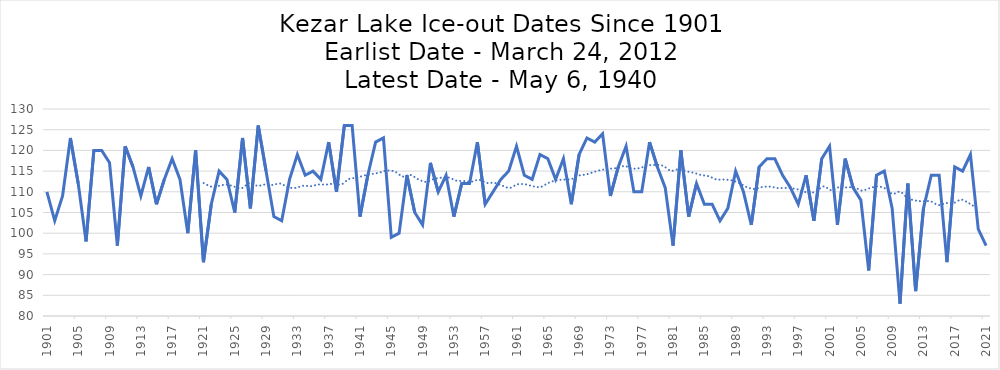
| Category | Series 0 |
|---|---|
| 1901-01-01 | 110 |
| 1902-01-02 | 103 |
| 1903-01-03 | 109 |
| 1904-01-04 | 123 |
| 1905-01-04 | 112 |
| 1906-01-05 | 98 |
| 1907-01-06 | 120 |
| 1908-01-07 | 120 |
| 1909-01-07 | 117 |
| 1910-01-08 | 97 |
| 1911-01-09 | 121 |
| 1912-01-10 | 116 |
| 1913-01-10 | 109 |
| 1914-01-11 | 116 |
| 1915-01-12 | 107 |
| 1916-01-13 | 113 |
| 1917-01-13 | 118 |
| 1918-01-14 | 113 |
| 1919-01-15 | 100 |
| 1920-01-16 | 120 |
| 1921-01-16 | 93 |
| 1922-01-17 | 107 |
| 1923-01-18 | 115 |
| 1924-01-19 | 113 |
| 1925-01-19 | 105 |
| 1926-01-20 | 123 |
| 1927-01-21 | 106 |
| 1928-01-22 | 126 |
| 1929-01-22 | 115 |
| 1930-01-23 | 104 |
| 1931-01-24 | 103 |
| 1932-01-25 | 113 |
| 1933-01-25 | 119 |
| 1934-01-26 | 114 |
| 1935-01-27 | 115 |
| 1936-01-28 | 113 |
| 1937-01-28 | 122 |
| 1938-01-29 | 110 |
| 1939-01-30 | 126 |
| 1940-01-31 | 126 |
| 1941-01-31 | 104 |
| 1942-02-01 | 114 |
| 1943-02-02 | 122 |
| 1944-02-03 | 123 |
| 1945-02-03 | 99 |
| 1946-02-04 | 100 |
| 1947-02-05 | 114 |
| 1948-02-06 | 105 |
| 1949-02-06 | 102 |
| 1950-02-07 | 117 |
| 1951-02-08 | 110 |
| 1952-02-09 | 114 |
| 1953-02-09 | 104 |
| 1954-02-10 | 112 |
| 1955-02-11 | 112 |
| 1956-02-12 | 122 |
| 1957-02-12 | 107 |
| 1958-02-13 | 110 |
| 1959-02-14 | 113 |
| 1960-02-15 | 115 |
| 1961-02-15 | 121 |
| 1962-02-16 | 114 |
| 1963-02-17 | 113 |
| 1964-02-18 | 119 |
| 1965-02-18 | 118 |
| 1966-02-19 | 113 |
| 1967-02-20 | 118 |
| 1968-02-21 | 107 |
| 1969-02-21 | 119 |
| 1970-02-22 | 123 |
| 1971-02-23 | 122 |
| 1972-02-24 | 124 |
| 1973-02-24 | 109 |
| 1974-02-25 | 116 |
| 1975-02-26 | 121 |
| 1976-02-27 | 110 |
| 1977-02-27 | 110 |
| 1978-02-28 | 122 |
| 1979-03-01 | 116 |
| 1980-03-01 | 111 |
| 1981-03-02 | 97 |
| 1982-03-03 | 120 |
| 1983-03-04 | 104 |
| 1984-03-04 | 112 |
| 1985-03-05 | 107 |
| 1986-03-06 | 107 |
| 1987-03-07 | 103 |
| 1988-03-07 | 106 |
| 1989-03-08 | 115 |
| 1990-03-09 | 110 |
| 1991-03-10 | 102 |
| 1992-03-10 | 116 |
| 1993-03-11 | 118 |
| 1994-03-12 | 118 |
| 1995-03-13 | 114 |
| 1996-03-13 | 111 |
| 1997-03-14 | 107 |
| 1998-03-15 | 114 |
| 1999-03-16 | 103 |
| 2000-03-16 | 118 |
| 2001-03-17 | 121 |
| 2002-03-18 | 102 |
| 2003-03-19 | 118 |
| 2004-03-19 | 111 |
| 2005-03-20 | 108 |
| 2006-03-21 | 91 |
| 2007-03-22 | 114 |
| 2008-03-22 | 115 |
| 2009-03-23 | 106 |
| 2010-03-24 | 83 |
| 2011-03-25 | 112 |
| 2012-03-25 | 86 |
| 2013-03-26 | 106 |
| 2014-03-27 | 114 |
| 2015-03-28 | 114 |
| 2016-03-28 | 93 |
| 2017-03-29 | 116 |
| 2018-03-30 | 115 |
| 2019-03-31 | 119 |
| 2020-03-31 | 101 |
| 2021-04-01 | 97 |